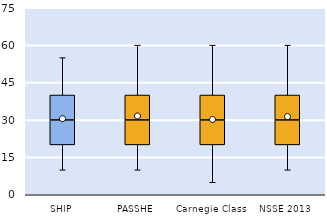
| Category | 25th | 50th | 75th |
|---|---|---|---|
| SHIP | 20 | 10 | 10 |
| PASSHE | 20 | 10 | 10 |
| Carnegie Class | 20 | 10 | 10 |
| NSSE 2013 | 20 | 10 | 10 |